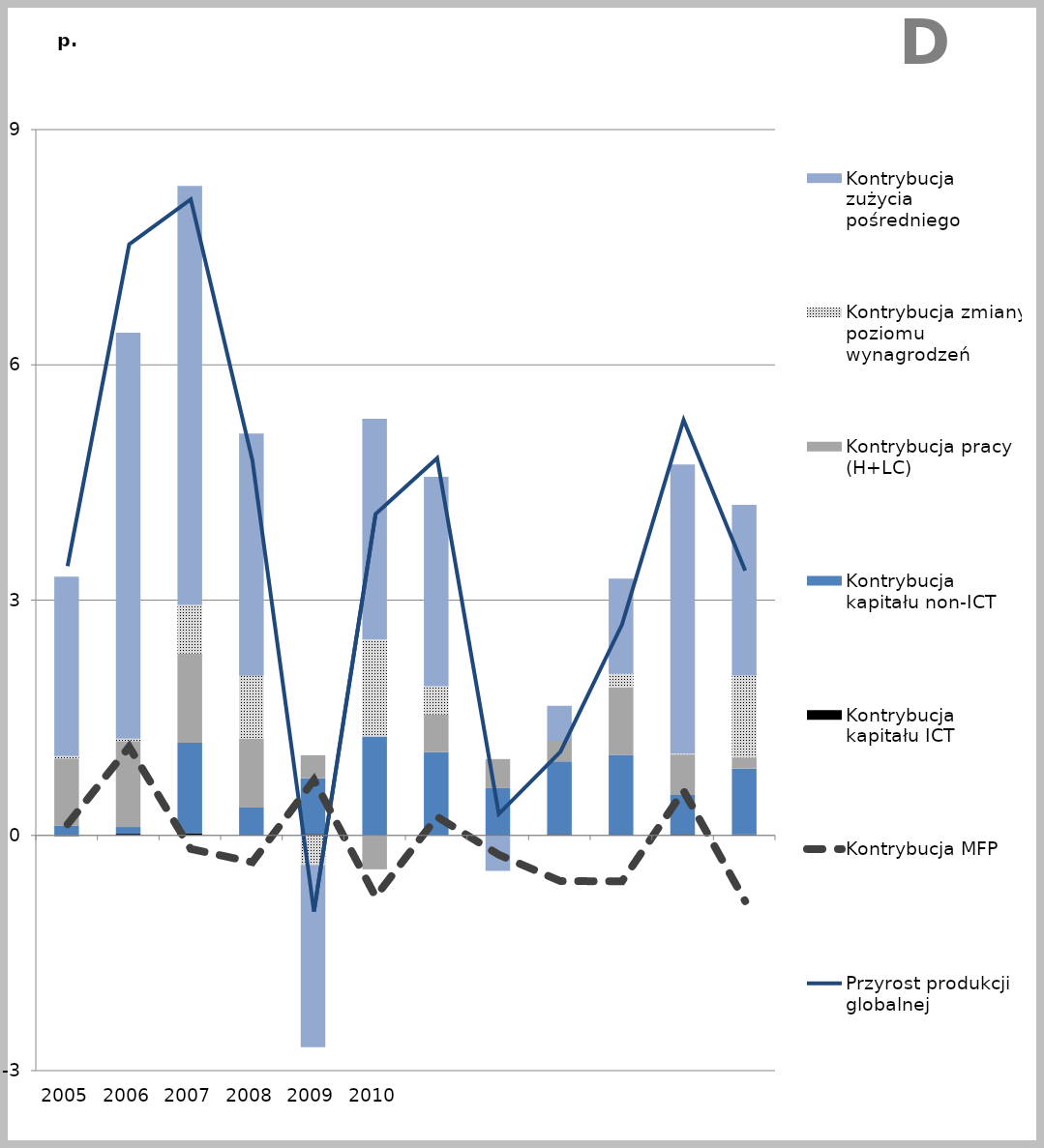
| Category | Kontrybucja kapitału ICT | Kontrybucja kapitału non-ICT | Kontrybucja pracy (H+LC) | Kontrybucja zmiany poziomu wynagrodzeń | Kontrybucja zużycia pośredniego |
|---|---|---|---|---|---|
| 2005.0 | -0.008 | 0.123 | 0.857 | 0.031 | 2.289 |
| 2006.0 | 0.02 | 0.087 | 1.095 | 0.03 | 5.178 |
| 2007.0 | 0.028 | 1.153 | 1.139 | 0.617 | 5.346 |
| 2008.0 | 0.008 | 0.348 | 0.877 | 0.803 | 3.089 |
| 2009.0 | 0.017 | 0.711 | 0.294 | -0.379 | -2.321 |
| 2010.0 | -0.003 | 1.262 | -0.43 | 1.239 | 2.811 |